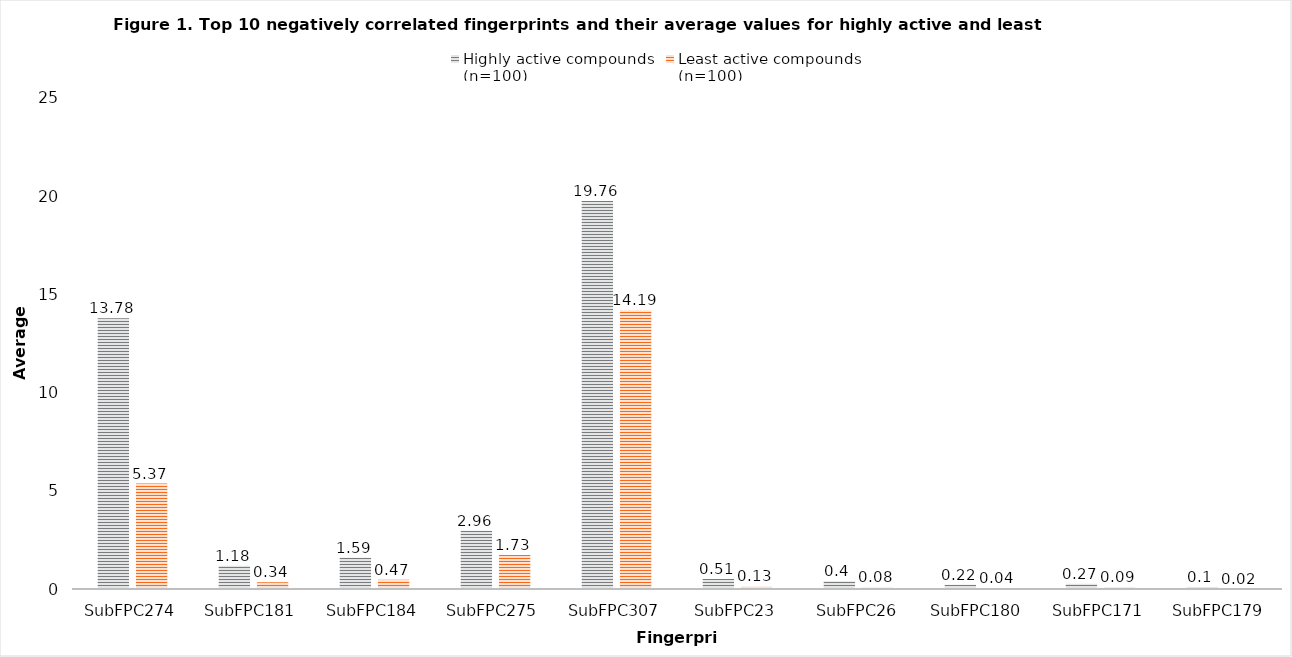
| Category | Highly active compounds 
(n=100) | Least active compounds 
(n=100) |
|---|---|---|
| SubFPC274 | 13.78 | 5.37 |
| SubFPC181 | 1.18 | 0.34 |
| SubFPC184 | 1.59 | 0.47 |
| SubFPC275 | 2.96 | 1.73 |
| SubFPC307 | 19.76 | 14.19 |
| SubFPC23 | 0.51 | 0.13 |
| SubFPC26 | 0.4 | 0.08 |
| SubFPC180 | 0.22 | 0.04 |
| SubFPC171 | 0.27 | 0.09 |
| SubFPC179 | 0.1 | 0.02 |